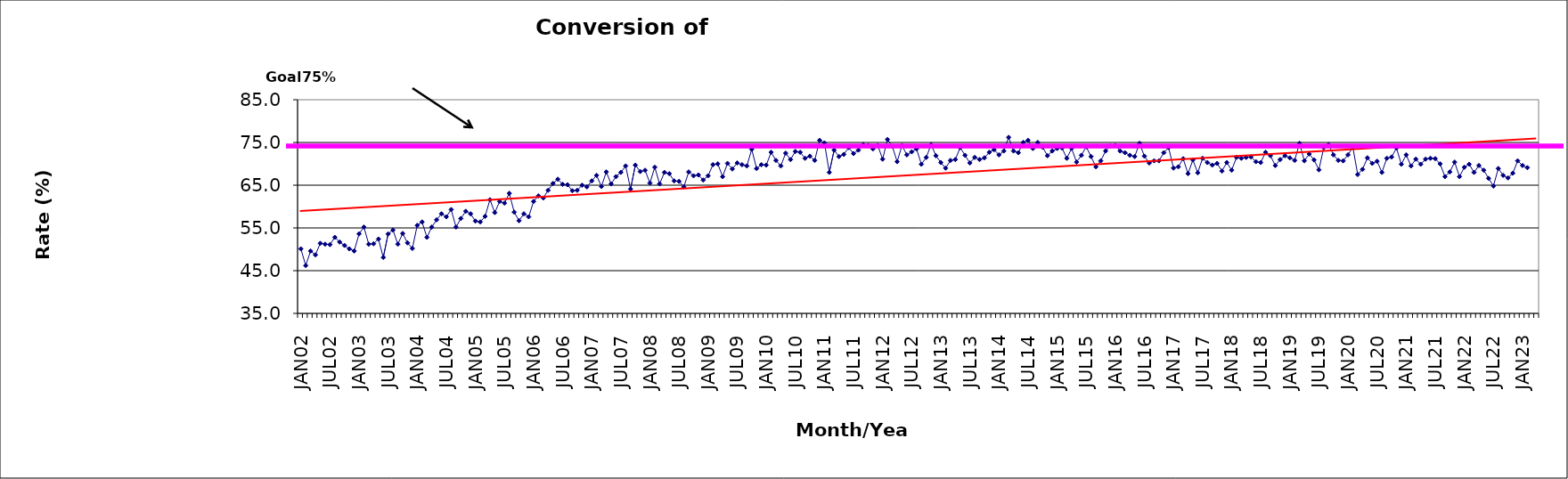
| Category | Series 0 |
|---|---|
| JAN02 | 50.1 |
| FEB02 | 46.2 |
| MAR02 | 49.6 |
| APR02 | 48.7 |
| MAY02 | 51.4 |
| JUN02 | 51.2 |
| JUL02 | 51.1 |
| AUG02 | 52.8 |
| SEP02 | 51.7 |
| OCT02 | 50.9 |
| NOV02 | 50.1 |
| DEC02 | 49.6 |
| JAN03 | 53.6 |
| FEB03 | 55.2 |
| MAR03 | 51.2 |
| APR03 | 51.3 |
| MAY03 | 52.4 |
| JUN03 | 48.1 |
| JUL03 | 53.6 |
| AUG03 | 54.5 |
| SEP03 | 51.2 |
| OCT03 | 53.7 |
| NOV03 | 51.5 |
| DEC03 | 50.2 |
| JAN04 | 55.6 |
| FEB04 | 56.4 |
| MAR04 | 52.8 |
| APR04 | 55.2 |
| MAY04 | 56.9 |
| JUN04 | 58.3 |
| JUL04 | 57.6 |
| AUG04 | 59.3 |
| SEP04 | 55.2 |
| OCT04 | 57.2 |
| NOV04 | 58.9 |
| DEC04 | 58.3 |
| JAN05 | 56.6 |
| FEB05 | 56.4 |
| MAR05 | 57.7 |
| APR05 | 61.6 |
| MAY05 | 58.6 |
| JUN05 | 61.2 |
| JUL05 | 60.8 |
| AUG05 | 63.1 |
| SEP05 | 58.7 |
| OCT05 | 56.7 |
| NOV05 | 58.3 |
| DEC05 | 57.6 |
| JAN06 | 61.2 |
| FEB06 | 62.5 |
| MAR06 | 62 |
| APR06 | 63.8 |
| MAY06 | 65.4 |
| JUN06 | 66.4 |
| JUL06 | 65.2 |
| AUG06 | 65.1 |
| SEP06 | 63.7 |
| OCT06 | 63.8 |
| NOV06 | 65 |
| DEC06 | 64.6 |
| JAN07 | 66 |
| FEB07 | 67.3 |
| MAR07 | 64.7 |
| APR07 | 68.1 |
| MAY07 | 65.3 |
| JUN07 | 67 |
| JUL07 | 68 |
| AUG07 | 69.5 |
| SEP07 | 64.1 |
| OCT07 | 69.7 |
| NOV07 | 68.2 |
| DEC07 | 68.5 |
| JAN08 | 65.5 |
| FEB08 | 69.2 |
| MAR08 | 65.3 |
| APR08 | 68 |
| MAY08 | 67.7 |
| JUN08 | 66 |
| JUL08 | 65.9 |
| AUG08 | 64.6 |
| SEP08 | 68.1 |
| OCT08 | 67.2 |
| NOV08 | 67.4 |
| DEC08 | 66.2 |
| JAN09 | 67.2 |
| FEB09 | 69.8 |
| MAR09 | 70 |
| APR09 | 67 |
| MAY09 | 70.1 |
| JUN09 | 68.8 |
| JUL09 | 70.2 |
| AUG09 | 69.8 |
| SEP09 | 69.5 |
| OCT09 | 73.4 |
| NOV09 | 68.9 |
| DEC09 | 69.8 |
| JAN10 | 69.7 |
| FEB10 | 72.7 |
| MAR10 | 70.8 |
| APR10 | 69.5 |
| MAY10 | 72.5 |
| JUN10 | 71 |
| JUL10 | 72.9 |
| AUG10 | 72.7 |
| SEP10 | 71.3 |
| OCT10 | 71.8 |
| NOV10 | 70.8 |
| DEC10 | 75.5 |
| JAN11 | 74.9 |
| FEB11 | 68 |
| MAR11 | 73.2 |
| APR11 | 71.7 |
| MAY11 | 72.2 |
| JUN11 | 73.8 |
| JUL11 | 72.4 |
| AUG11 | 73.2 |
| SEP11 | 74.5 |
| OCT11 | 74.3 |
| NOV11 | 73.5 |
| DEC11 | 74.3 |
| JAN12 | 71.1 |
| FEB12 | 75.7 |
| MAR12 | 74.1 |
| APR12 | 70.5 |
| MAY12 | 74.3 |
| JUN12 | 72.1 |
| JUL12 | 72.8 |
| AUG12 | 73.5 |
| SEP12 | 69.9 |
| OCT12 | 71.5 |
| NOV12 | 74.5 |
| DEC12 | 71.9 |
| JAN13 | 70.3 |
| FEB13 | 69 |
| MAR13 | 70.8 |
| APR13 | 71 |
| MAY13 | 73.8 |
| JUN13 | 72 |
| JUL13 | 70.2 |
| AUG13 | 71.5 |
| SEP13 | 71 |
| OCT13 | 71.4 |
| NOV13 | 72.7 |
| DEC13 | 73.3 |
| JAN14 | 72.1 |
| FEB14 | 73 |
| MAR14 | 76.2 |
| APR14 | 73 |
| MAY14 | 72.6 |
| JUN14 | 75 |
| JUL14 | 75.5 |
| AUG14 | 73.6 |
| SEP14 | 75 |
| OCT14 | 73.9 |
| NOV14 | 71.9 |
| DEC14 | 73 |
| JAN15 | 73.6 |
| FEB15 | 73.7 |
| MAR15 | 71.3 |
| APR15 | 73.6 |
| MAY15 | 70.4 |
| JUN15 | 72 |
| JUL15 | 74 |
| AUG15 | 71.7 |
| SEP15 | 69.3 |
| OCT15 | 70.7 |
| NOV15 | 73 |
| DEC15 | 74.2 |
| JAN16 | 74.3 |
| FEB16 | 73 |
| MAR16 | 72.6 |
| APR16 | 72 |
| MAY16 | 71.7 |
| JUN16 | 74.8 |
| JUL16 | 71.8 |
| AUG16 | 70.2 |
| SEP16 | 70.7 |
| OCT16 | 70.7 |
| NOV16 | 72.6 |
| DEC16 | 73.8 |
| JAN17 | 69 |
| FEB17 | 69.3 |
| MAR17 | 71.2 |
| APR17 | 67.7 |
| MAY17 | 70.9 |
| JUN17 | 67.9 |
| JUL17 | 71.3 |
| AUG17 | 70.3 |
| SEP17 | 69.7 |
| OCT17 | 70.1 |
| NOV17 | 68.3 |
| DEC17 | 70.3 |
| JAN18 | 68.5 |
| FEB18 | 71.5 |
| MAR18 | 71.3 |
| APR18 | 71.5 |
| MAY18 | 71.6 |
| JUN18 | 70.5 |
| JUL18 | 70.3 |
| AUG18 | 72.7 |
| SEP18 | 71.9 |
| OCT18 | 69.6 |
| NOV18 | 71 |
| DEC18 | 71.9 |
| JAN19 | 71.4 |
| FEB19 | 70.8 |
| MAR19 | 74.8 |
| APR19 | 70.7 |
| MAY19 | 72.3 |
| JUN19 | 70.9 |
| JUL19 | 68.6 |
| AUG19 | 73.8 |
| SEP19 | 74.5 |
| OCT19 | 72.1 |
| NOV19 | 70.8 |
| DEC19 | 70.7 |
| JAN20 | 72.1 |
| FEB20 | 73.9 |
| MAR20 | 67.5 |
| APR20 | 68.7 |
| MAY20 | 71.4 |
| JUN20 | 70.1 |
| JUL20 | 70.6 |
| AUG20 | 68 |
| SEP20 | 71.3 |
| OCT20 | 71.6 |
| NOV20 | 73.7 |
| DEC20 | 69.9 |
| JAN21 | 72.1 |
| FEB21 | 69.5 |
| MAR21 | 71.1 |
| APR21 | 69.9 |
| MAY21 | 71.1 |
| JUN21 | 71.3 |
| JUL21 | 71.2 |
| AUG21 | 70 |
| SEP21 | 67 |
| OCT21 | 68.1 |
| NOV21 | 70.4 |
| DEC21 | 67 |
| JAN22 | 69.2 |
| FEB22 | 69.9 |
| MAR22 | 68 |
| APR22 | 69.6 |
| MAY22 | 68.5 |
| JUN22 | 66.6 |
| JUL22 | 64.8 |
| AUG22 | 68.9 |
| SEP22 | 67.3 |
| OCT22 | 66.7 |
| NOV22 | 67.8 |
| DEC22 | 70.7 |
| JAN23 | 69.6 |
| FEB23 | 69.1 |